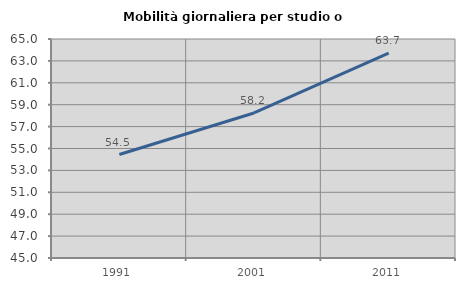
| Category | Mobilità giornaliera per studio o lavoro |
|---|---|
| 1991.0 | 54.452 |
| 2001.0 | 58.244 |
| 2011.0 | 63.71 |